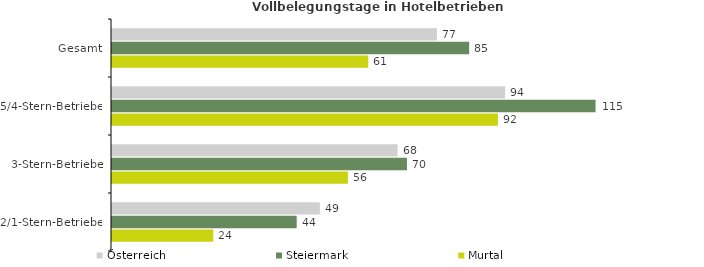
| Category | Österreich | Steiermark | Murtal |
|---|---|---|---|
| Gesamt | 77.394 | 85.042 | 61.013 |
| 5/4-Stern-Betriebe | 93.608 | 115.133 | 91.883 |
| 3-Stern-Betriebe | 67.992 | 70.225 | 56.171 |
| 2/1-Stern-Betriebe | 49.488 | 43.973 | 24.119 |